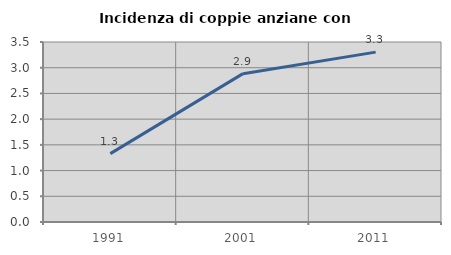
| Category | Incidenza di coppie anziane con figli |
|---|---|
| 1991.0 | 1.329 |
| 2001.0 | 2.885 |
| 2011.0 | 3.303 |